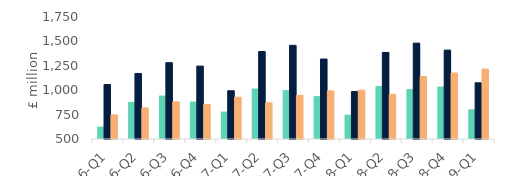
| Category | First-time
buyers | Homemovers | Homowner remortgaging |
|---|---|---|---|
| 16-Q1 | 626.897 | 1058.048 | 746.442 |
| 16-Q2 | 880.486 | 1171.36 | 818.657 |
| 16-Q3 | 945.203 | 1281.796 | 880.012 |
| 16-Q4 | 883.366 | 1247.008 | 853.502 |
| 17-Q1 | 781.078 | 994.423 | 928.449 |
| 17-Q2 | 1017.404 | 1396.407 | 870.301 |
| 17-Q3 | 1001.305 | 1459.494 | 947.474 |
| 17-Q4 | 939.498 | 1319.394 | 993.236 |
| 18-Q1 | 748.64 | 986.17 | 1000.731 |
| 18-Q2 | 1042.5 | 1386.525 | 958.471 |
| 18-Q3 | 1011.184 | 1482.124 | 1139.333 |
| 18-Q4 | 1037.176 | 1410.616 | 1176.096 |
| 19-Q1 | 804.752 | 1075.85 | 1216.637 |